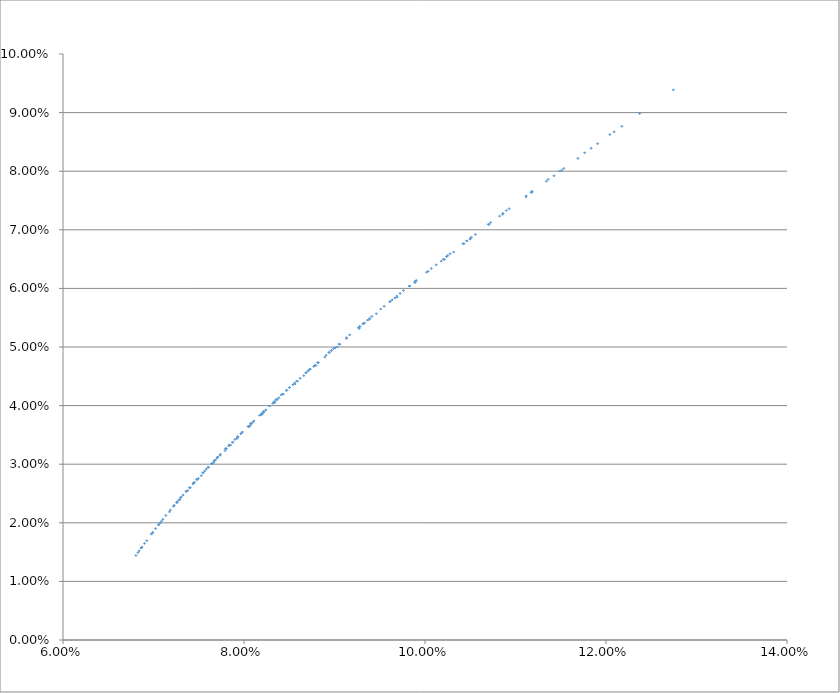
| Category | Series 0 |
|---|---|
| 0.06828365379221299 | 0.015 |
| 0.07022747770647508 | 0.019 |
| 0.07306999858170705 | 0.024 |
| 0.07544335755827838 | 0.029 |
| 0.07797789803393106 | 0.033 |
| 0.08075992930022335 | 0.037 |
| 0.08357449673825809 | 0.041 |
| 0.0873121177317841 | 0.046 |
| 0.09048907534454698 | 0.05 |
| 0.09365048965975775 | 0.055 |
| 0.09689650429970123 | 0.059 |
| 0.10123526409847136 | 0.064 |
| 0.10464383061706875 | 0.068 |
| 0.1082330974676759 | 0.072 |
| 0.11175792553070289 | 0.076 |
| 0.11533274177610245 | 0.08 |
| 0.11907546550909125 | 0.085 |
| 0.12372071266893896 | 0.09 |
| 0.12742932661794296 | 0.094 |
| 0.07058133412828824 | 0.02 |
| 0.07283875687129164 | 0.024 |
| 0.07452794052667241 | 0.027 |
| 0.07709815491212643 | 0.031 |
| 0.07899513303783341 | 0.034 |
| 0.08171774098498136 | 0.038 |
| 0.08468030247371733 | 0.043 |
| 0.08683810152504005 | 0.046 |
| 0.08988277102566583 | 0.05 |
| 0.09314037699219832 | 0.054 |
| 0.0963683787317191 | 0.058 |
| 0.09890094978199838 | 0.061 |
| 0.10238270307191162 | 0.065 |
| 0.10500792169537966 | 0.069 |
| 0.10860379962820084 | 0.073 |
| 0.11118011375524103 | 0.076 |
| 0.11486988798640278 | 0.08 |
| 0.11763696478438775 | 0.083 |
| 0.1204287397347954 | 0.086 |
| 0.07377971290093059 | 0.026 |
| 0.07495579598488163 | 0.028 |
| 0.0768546102141078 | 0.031 |
| 0.07872555247478435 | 0.034 |
| 0.08079349912253923 | 0.037 |
| 0.08281848732237629 | 0.04 |
| 0.08503173442273639 | 0.043 |
| 0.08718909932696199 | 0.046 |
| 0.08940557862205813 | 0.049 |
| 0.09264785030248726 | 0.053 |
| 0.0951091037490367 | 0.056 |
| 0.09761721476753647 | 0.06 |
| 0.10016866363664302 | 0.063 |
| 0.10276022228121101 | 0.066 |
| 0.10459545719222817 | 0.068 |
| 0.10724808473658258 | 0.071 |
| 0.10899081701288105 | 0.073 |
| 0.11182979214744504 | 0.077 |
| 0.11360535909975918 | 0.079 |
| 0.07664859657977072 | 0.03 |
| 0.07791000895377308 | 0.032 |
| 0.07920874857932451 | 0.034 |
| 0.08054300979368349 | 0.036 |
| 0.0819110567661364 | 0.038 |
| 0.08318447653660245 | 0.04 |
| 0.08540415144508635 | 0.044 |
| 0.08687757245555953 | 0.046 |
| 0.08907360434806694 | 0.049 |
| 0.09132566261534092 | 0.052 |
| 0.09388701427033791 | 0.055 |
| 0.09549274428820322 | 0.057 |
| 0.09725090652523037 | 0.059 |
| 0.099030588733743 | 0.061 |
| 0.10069437480024403 | 0.063 |
| 0.10251183440391219 | 0.066 |
| 0.10420953093598162 | 0.068 |
| 0.10513315634122472 | 0.069 |
| 0.10699309355526111 | 0.071 |
| 0.0690015731272104 | 0.016 |
| 0.07103431709741506 | 0.021 |
| 0.072570607573703 | 0.023 |
| 0.0743579368101749 | 0.027 |
| 0.07549763594918624 | 0.029 |
| 0.07675490603901153 | 0.031 |
| 0.07805019146034303 | 0.033 |
| 0.07929995329506487 | 0.035 |
| 0.08066427784431343 | 0.037 |
| 0.0820613372209275 | 0.039 |
| 0.08434540635740913 | 0.042 |
| 0.08661182738143482 | 0.045 |
| 0.08894004308442727 | 0.048 |
| 0.09132532747338724 | 0.051 |
| 0.09462047741074747 | 0.056 |
| 0.09888624663225189 | 0.061 |
| 0.10316375769551214 | 0.066 |
| 0.10858370607612845 | 0.073 |
| 0.116897843390374 | 0.082 |
| 0.07070380408137278 | 0.02 |
| 0.07228554625392836 | 0.023 |
| 0.07396788321745153 | 0.026 |
| 0.07583170667817087 | 0.029 |
| 0.07709551665834224 | 0.031 |
| 0.0783969633257973 | 0.033 |
| 0.0797342037484113 | 0.035 |
| 0.08110546747832083 | 0.037 |
| 0.08327093071679852 | 0.041 |
| 0.08472052941827177 | 0.043 |
| 0.0878050947031637 | 0.047 |
| 0.09005954083344507 | 0.05 |
| 0.09332116181515954 | 0.054 |
| 0.09667268753367618 | 0.058 |
| 0.10179221752317633 | 0.065 |
| 0.10706422741794189 | 0.071 |
| 0.11341896485147043 | 0.078 |
| 0.12175672443981528 | 0.088 |
| 0.0687106581177126 | 0.016 |
| 0.07136133897850705 | 0.021 |
| 0.07297971357230362 | 0.024 |
| 0.07478755351551418 | 0.027 |
| 0.07669145507375412 | 0.031 |
| 0.07797789803393106 | 0.033 |
| 0.07930082030501148 | 0.035 |
| 0.08075992930022335 | 0.037 |
| 0.08215159300595784 | 0.039 |
| 0.08357449673825809 | 0.041 |
| 0.08502707213286094 | 0.043 |
| 0.0873121177317841 | 0.046 |
| 0.08965751704617081 | 0.049 |
| 0.09279577309824451 | 0.053 |
| 0.09613466677158665 | 0.058 |
| 0.10033470216622078 | 0.063 |
| 0.10556526350307203 | 0.069 |
| 0.11175792553070289 | 0.076 |
| 0.12090145595201823 | 0.087 |
| 0.06984782082001822 | 0.018 |
| 0.07264310293340946 | 0.024 |
| 0.07442774164103735 | 0.027 |
| 0.07641367528675622 | 0.03 |
| 0.07838971345314188 | 0.033 |
| 0.07982786473164395 | 0.035 |
| 0.08044940106958484 | 0.036 |
| 0.08194159687198273 | 0.039 |
| 0.08335328363126068 | 0.041 |
| 0.08412861677812565 | 0.042 |
| 0.08558528571765758 | 0.044 |
| 0.0870698129120679 | 0.046 |
| 0.08940557862205813 | 0.049 |
| 0.09167688476837153 | 0.052 |
| 0.09411946396789685 | 0.055 |
| 0.09825472082228542 | 0.06 |
| 0.10238270307191162 | 0.065 |
| 0.1092927689246834 | 0.074 |
| 0.06842340972953627 | 0.015 |
| 0.06925487871260078 | 0.017 |
| 0.07075392826406601 | 0.02 |
| 0.07176979151003973 | 0.022 |
| 0.07289483243812099 | 0.024 |
| 0.07406419133269444 | 0.026 |
| 0.07527580287281771 | 0.028 |
| 0.07652766021070884 | 0.03 |
| 0.07851416978963037 | 0.033 |
| 0.08058367384859938 | 0.036 |
| 0.08197928848978807 | 0.038 |
| 0.08340607418194092 | 0.041 |
| 0.08564364044550118 | 0.044 |
| 0.08794517974185068 | 0.047 |
| 0.09030580094129 | 0.05 |
| 0.09272099158347422 | 0.053 |
| 0.0969217591684554 | 0.059 |
| 0.1021515153344787 | 0.065 |
| 0.06806269070858277 | 0.014 |
| 0.06992054903465497 | 0.018 |
| 0.07088825680830455 | 0.02 |
| 0.072570607573703 | 0.023 |
| 0.07364996233274637 | 0.025 |
| 0.07484562206680564 | 0.027 |
| 0.0760822683173702 | 0.029 |
| 0.07735793547440753 | 0.032 |
| 0.07875294034067049 | 0.034 |
| 0.0808331440456094 | 0.037 |
| 0.08223295394558018 | 0.039 |
| 0.0836636986495976 | 0.041 |
| 0.08591037388383316 | 0.044 |
| 0.08822035911705801 | 0.047 |
| 0.09058881132556404 | 0.05 |
| 0.09386374010686092 | 0.055 |
| 0.09888624663225189 | 0.061 |
| 0.10499094350324288 | 0.068 |
| 0.1150933749169202 | 0.08 |
| 0.06863430742064214 | 0.016 |
| 0.07054525090906817 | 0.02 |
| 0.07220324999866905 | 0.023 |
| 0.07325918503608121 | 0.025 |
| 0.0744383403473891 | 0.027 |
| 0.07565922980042662 | 0.029 |
| 0.07700635959456371 | 0.031 |
| 0.07830633749518096 | 0.033 |
| 0.0796421985169182 | 0.035 |
| 0.0810121675805819 | 0.037 |
| 0.0824145437795871 | 0.039 |
| 0.08384770107455387 | 0.041 |
| 0.08619850651942727 | 0.045 |
| 0.08770342733465045 | 0.047 |
| 0.09005954083344507 | 0.05 |
| 0.09321569387195651 | 0.054 |
| 0.09832387714690022 | 0.06 |
| 0.10429683574712417 | 0.068 |
| 0.11425453517161191 | 0.079 |
| 0.06976330168242781 | 0.018 |
| 0.07186031076895691 | 0.022 |
| 0.07360143650338613 | 0.025 |
| 0.07478755351551418 | 0.027 |
| 0.07601499250218273 | 0.029 |
| 0.07737887629530309 | 0.032 |
| 0.07797789803393106 | 0.033 |
| 0.07930082030501148 | 0.035 |
| 0.08075992930022335 | 0.037 |
| 0.08215159300595784 | 0.039 |
| 0.08357449673825809 | 0.041 |
| 0.08424482164477012 | 0.042 |
| 0.08581740520538828 | 0.044 |
| 0.08812388507136862 | 0.047 |
| 0.08965751704617081 | 0.049 |
| 0.09279577309824451 | 0.053 |
| 0.09613466677158665 | 0.058 |
| 0.10202256361490121 | 0.065 |
| 0.11175792553070289 | 0.076 |
| 0.0687106581177126 | 0.016 |
| 0.11835303927417302 | 0.084 |
| 0.11117444145839434 | 0.076 |